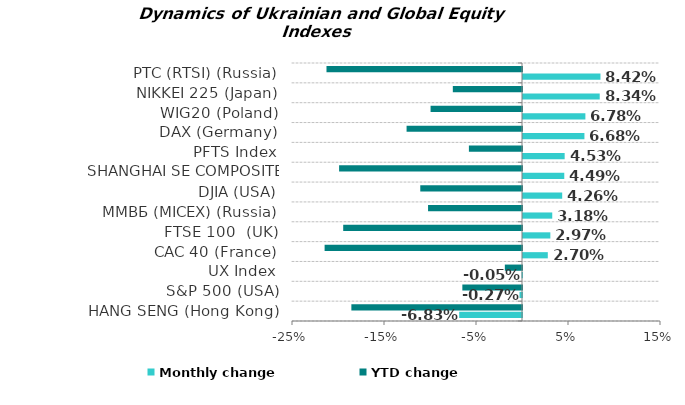
| Category | Monthly change | YTD change |
|---|---|---|
| HANG SENG (Hong Kong) | -0.068 | -0.185 |
| S&P 500 (USA) | -0.003 | -0.065 |
| UX Index | 0 | -0.019 |
| CAC 40 (France) | 0.027 | -0.215 |
| FTSE 100  (UK) | 0.03 | -0.194 |
| ММВБ (MICEX) (Russia) | 0.032 | -0.102 |
| DJIA (USA) | 0.043 | -0.111 |
| SHANGHAI SE COMPOSITE (China) | 0.045 | -0.199 |
| PFTS Index | 0.045 | -0.058 |
| DAX (Germany) | 0.067 | -0.125 |
| WIG20 (Poland) | 0.068 | -0.099 |
| NIKKEI 225 (Japan) | 0.083 | -0.075 |
| РТС (RTSI) (Russia) | 0.084 | -0.213 |